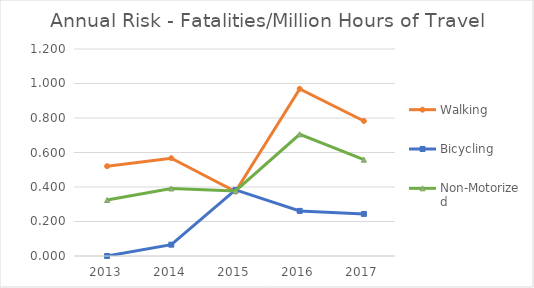
| Category | Walking | Bicycling | Non-Motorized |
|---|---|---|---|
| 2013 | 0.52 | 0 | 0.325 |
| 2014 | 0.567 | 0.066 | 0.391 |
| 2015 | 0.373 | 0.383 | 0.377 |
| 2016 | 0.969 | 0.261 | 0.706 |
| 2017 | 0.783 | 0.244 | 0.558 |